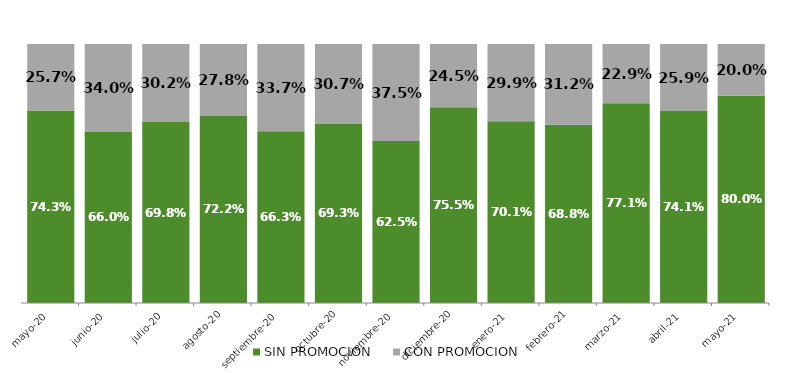
| Category | SIN PROMOCION   | CON PROMOCION   |
|---|---|---|
| 2020-05-01 | 0.743 | 0.257 |
| 2020-06-01 | 0.66 | 0.34 |
| 2020-07-01 | 0.698 | 0.302 |
| 2020-08-01 | 0.722 | 0.278 |
| 2020-09-01 | 0.663 | 0.337 |
| 2020-10-01 | 0.693 | 0.307 |
| 2020-11-01 | 0.625 | 0.375 |
| 2020-12-01 | 0.755 | 0.245 |
| 2021-01-01 | 0.701 | 0.299 |
| 2021-02-01 | 0.688 | 0.312 |
| 2021-03-01 | 0.771 | 0.229 |
| 2021-04-01 | 0.741 | 0.259 |
| 2021-05-01 | 0.8 | 0.2 |